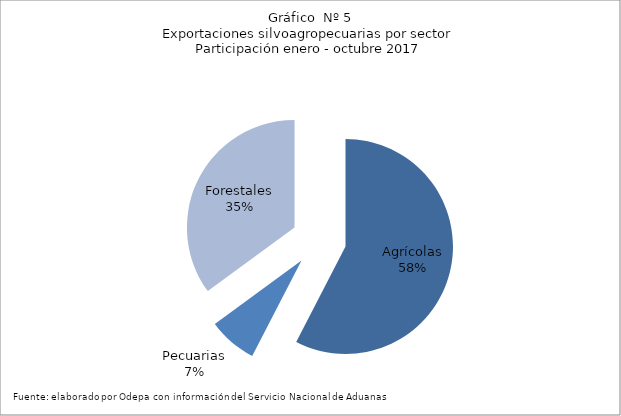
| Category | Series 0 |
|---|---|
| Agrícolas | 7700678 |
| Pecuarias | 982126 |
| Forestales | 4690397 |